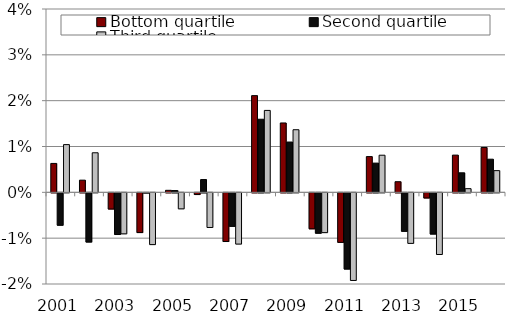
| Category | Bottom quartile | Second quartile | Third quartile |
|---|---|---|---|
| 2001.0 | 0.006 | -0.007 | 0.01 |
| 2002.0 | 0.003 | -0.011 | 0.009 |
| 2003.0 | -0.004 | -0.009 | -0.009 |
| 2004.0 | -0.009 | 0 | -0.011 |
| 2005.0 | 0 | 0 | -0.003 |
| 2006.0 | 0 | 0.003 | -0.008 |
| 2007.0 | -0.011 | -0.007 | -0.011 |
| 2008.0 | 0.021 | 0.016 | 0.018 |
| 2009.0 | 0.015 | 0.011 | 0.014 |
| 2010.0 | -0.008 | -0.009 | -0.009 |
| 2011.0 | -0.011 | -0.017 | -0.019 |
| 2012.0 | 0.008 | 0.006 | 0.008 |
| 2013.0 | 0.002 | -0.008 | -0.011 |
| 2014.0 | -0.001 | -0.009 | -0.013 |
| 2015.0 | 0.008 | 0.004 | 0.001 |
| 2016.0 | 0.01 | 0.007 | 0.005 |